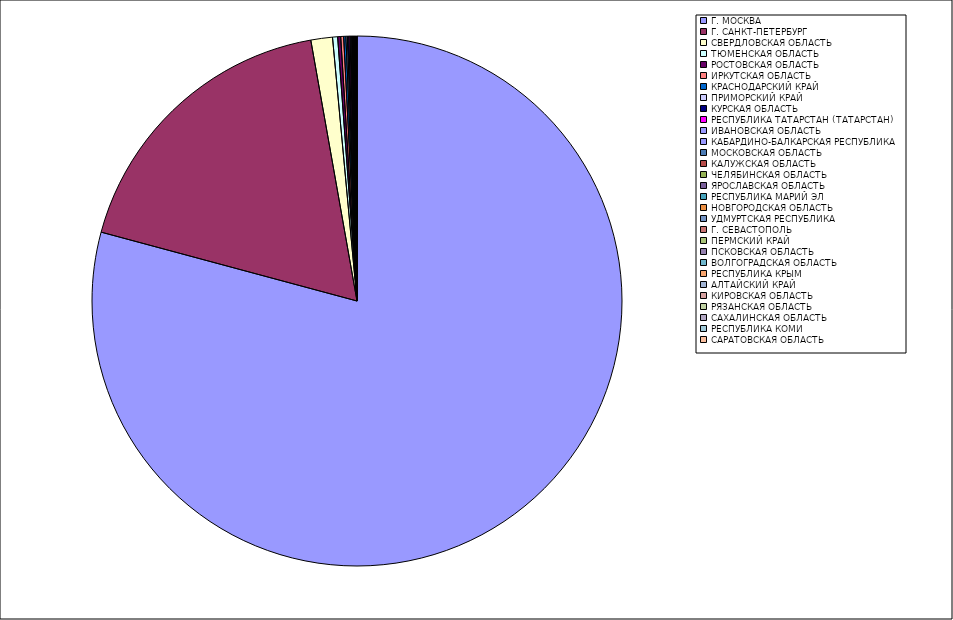
| Category | Оборот |
|---|---|
| Г. МОСКВА | 79.143 |
| Г. САНКТ-ПЕТЕРБУРГ | 18.016 |
| СВЕРДЛОВСКАЯ ОБЛАСТЬ | 1.315 |
| ТЮМЕНСКАЯ ОБЛАСТЬ | 0.31 |
| РОСТОВСКАЯ ОБЛАСТЬ | 0.185 |
| ИРКУТСКАЯ ОБЛАСТЬ | 0.177 |
| КРАСНОДАРСКИЙ КРАЙ | 0.133 |
| ПРИМОРСКИЙ КРАЙ | 0.088 |
| КУРСКАЯ ОБЛАСТЬ | 0.083 |
| РЕСПУБЛИКА ТАТАРСТАН (ТАТАРСТАН) | 0.076 |
| ИВАНОВСКАЯ ОБЛАСТЬ | 0.053 |
| КАБАРДИНО-БАЛКАРСКАЯ РЕСПУБЛИКА | 0.051 |
| МОСКОВСКАЯ ОБЛАСТЬ | 0.038 |
| КАЛУЖСКАЯ ОБЛАСТЬ | 0.036 |
| ЧЕЛЯБИНСКАЯ ОБЛАСТЬ | 0.033 |
| ЯРОСЛАВСКАЯ ОБЛАСТЬ | 0.022 |
| РЕСПУБЛИКА МАРИЙ ЭЛ | 0.022 |
| НОВГОРОДСКАЯ ОБЛАСТЬ | 0.021 |
| УДМУРТСКАЯ РЕСПУБЛИКА | 0.021 |
| Г. СЕВАСТОПОЛЬ | 0.02 |
| ПЕРМСКИЙ КРАЙ | 0.016 |
| ПСКОВСКАЯ ОБЛАСТЬ | 0.013 |
| ВОЛГОГРАДСКАЯ ОБЛАСТЬ | 0.013 |
| РЕСПУБЛИКА КРЫМ | 0.013 |
| АЛТАЙСКИЙ КРАЙ | 0.011 |
| КИРОВСКАЯ ОБЛАСТЬ | 0.01 |
| РЯЗАНСКАЯ ОБЛАСТЬ | 0.009 |
| САХАЛИНСКАЯ ОБЛАСТЬ | 0.008 |
| РЕСПУБЛИКА КОМИ | 0.007 |
| САРАТОВСКАЯ ОБЛАСТЬ | 0.007 |